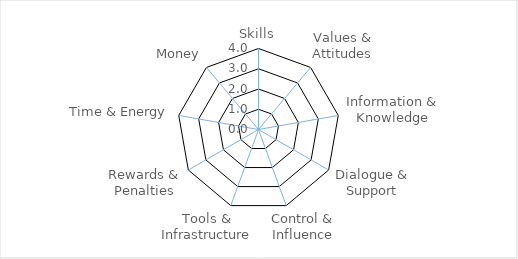
| Category | Series 0 |
|---|---|
| Skills | 0 |
| Values & Attitudes | 0 |
| Information & Knowledge | 0 |
| Dialogue & Support | 0 |
| Control & Influence | 0 |
| Tools & Infrastructure | 0 |
| Rewards & Penalties | 0 |
| Time & Energy | 0 |
| Money | 0 |